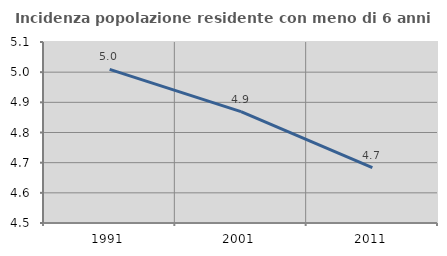
| Category | Incidenza popolazione residente con meno di 6 anni |
|---|---|
| 1991.0 | 5.009 |
| 2001.0 | 4.869 |
| 2011.0 | 4.683 |